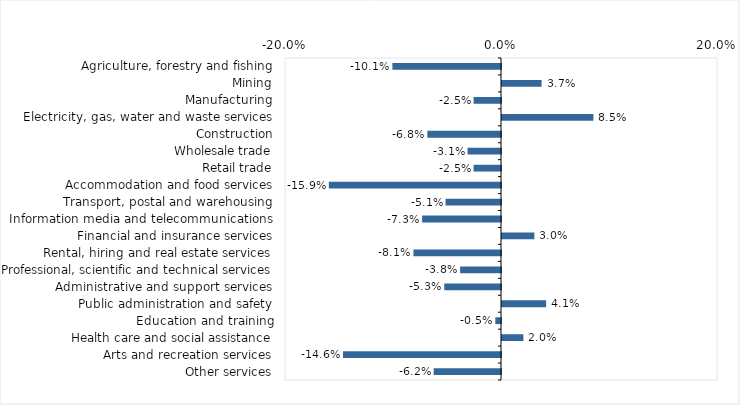
| Category | This week |
|---|---|
| Agriculture, forestry and fishing | -0.101 |
| Mining | 0.037 |
| Manufacturing | -0.025 |
| Electricity, gas, water and waste services | 0.085 |
| Construction | -0.068 |
| Wholesale trade | -0.031 |
| Retail trade | -0.025 |
| Accommodation and food services | -0.159 |
| Transport, postal and warehousing | -0.051 |
| Information media and telecommunications | -0.073 |
| Financial and insurance services | 0.03 |
| Rental, hiring and real estate services | -0.081 |
| Professional, scientific and technical services | -0.038 |
| Administrative and support services | -0.053 |
| Public administration and safety | 0.041 |
| Education and training | -0.005 |
| Health care and social assistance | 0.02 |
| Arts and recreation services | -0.146 |
| Other services | -0.062 |